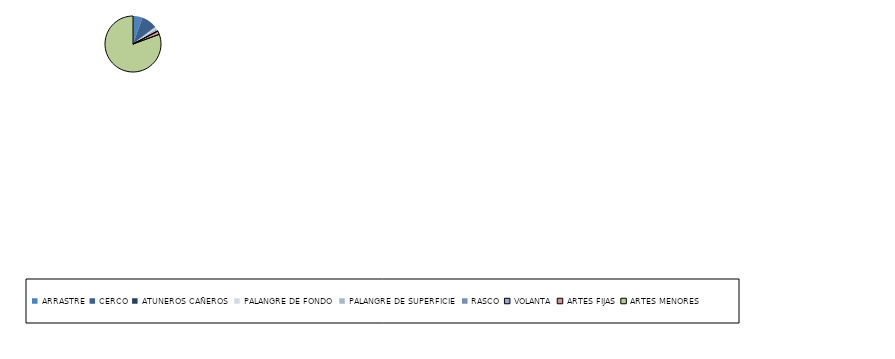
| Category | Series 0 |
|---|---|
| ARRASTRE | 13 |
| CERCO | 21 |
| ATUNEROS CAÑEROS | 1 |
| PALANGRE DE FONDO | 2 |
| PALANGRE DE SUPERFICIE | 4 |
| RASCO | 0 |
| VOLANTA | 0 |
| ARTES FIJAS | 5 |
| ARTES MENORES | 191 |